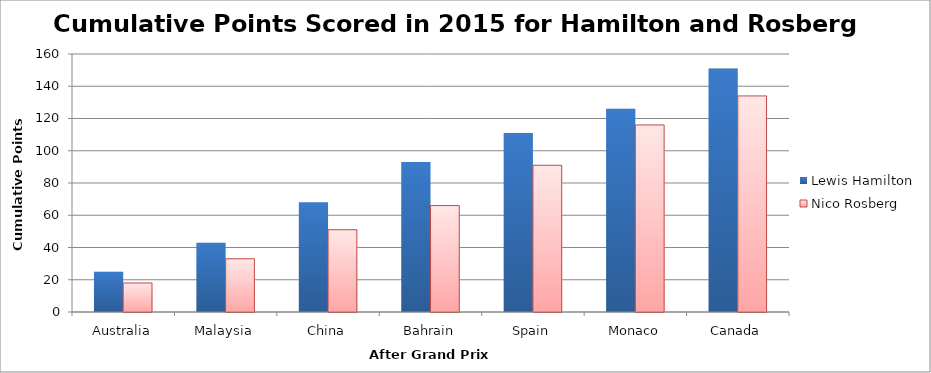
| Category | Lewis Hamilton | Nico Rosberg |
|---|---|---|
| Australia | 25 | 18 |
| Malaysia | 43 | 33 |
| China | 68 | 51 |
| Bahrain | 93 | 66 |
| Spain | 111 | 91 |
| Monaco | 126 | 116 |
| Canada | 151 | 134 |